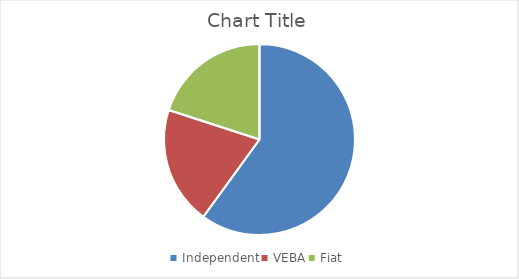
| Category | Series 0 |
|---|---|
| Independent | 3 |
| VEBA | 1 |
| Fiat | 1 |